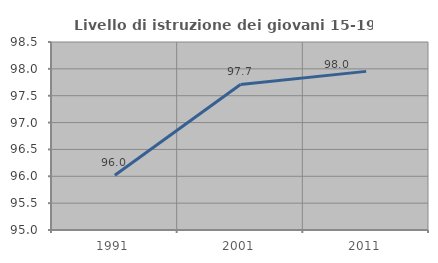
| Category | Livello di istruzione dei giovani 15-19 anni |
|---|---|
| 1991.0 | 96.018 |
| 2001.0 | 97.71 |
| 2011.0 | 97.953 |